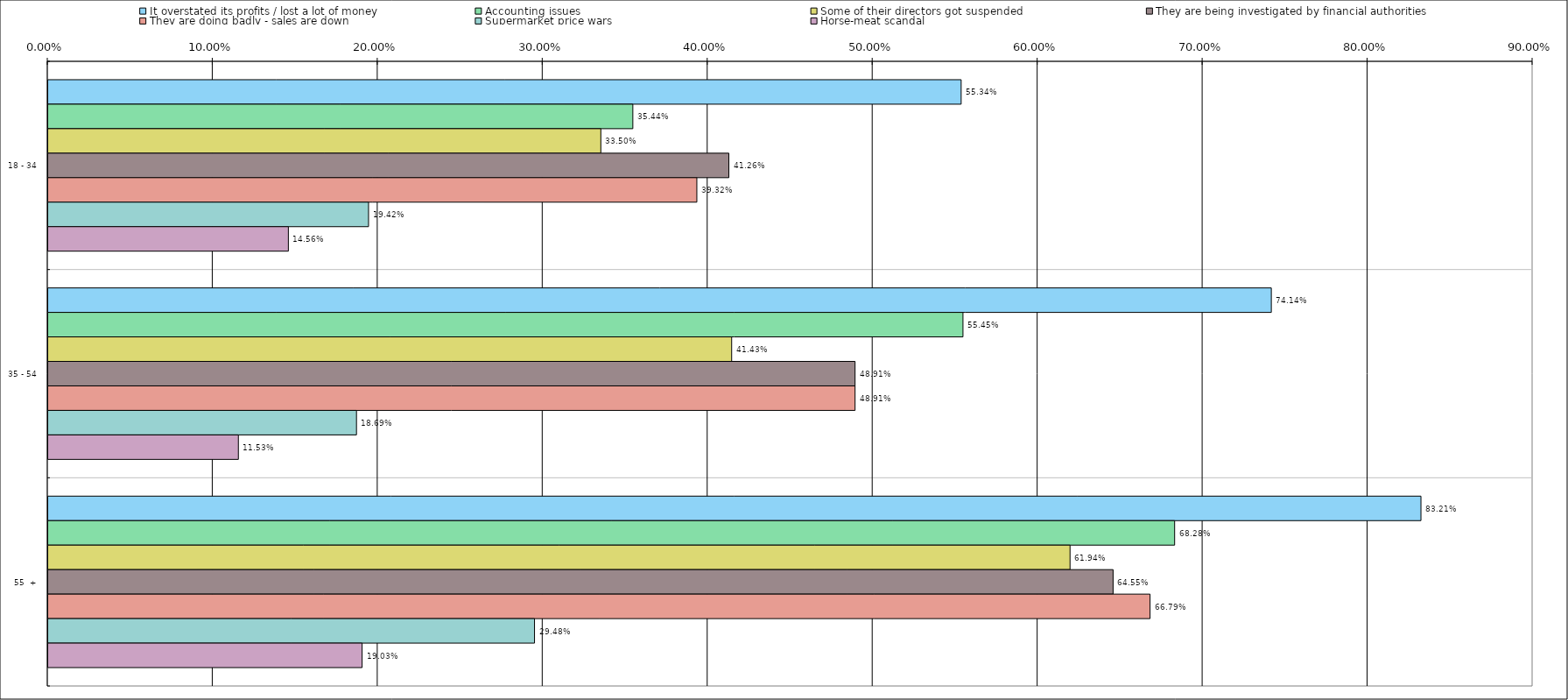
| Category | It overstated its profits / lost a lot of money | Accounting issues | Some of their directors got suspended | They are being investigated by financial authorities | They are doing badly - sales are down | Supermarket price wars | Horse-meat scandal |
|---|---|---|---|---|---|---|---|
| 0 | 0.553 | 0.354 | 0.335 | 0.413 | 0.393 | 0.194 | 0.146 |
| 1 | 0.741 | 0.554 | 0.414 | 0.489 | 0.489 | 0.187 | 0.115 |
| 2 | 0.832 | 0.683 | 0.619 | 0.646 | 0.668 | 0.295 | 0.19 |